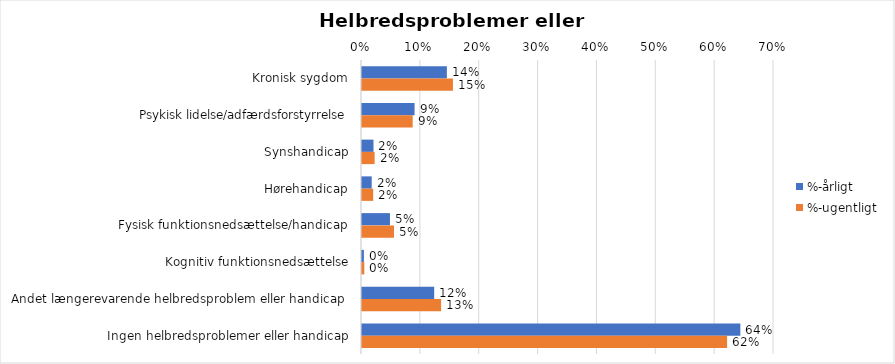
| Category | %-årligt | %-ugentligt |
|---|---|---|
| Kronisk sygdom | 0.144 | 0.155 |
| Psykisk lidelse/adfærdsforstyrrelse | 0.089 | 0.086 |
| Synshandicap | 0.02 | 0.021 |
| Hørehandicap | 0.016 | 0.019 |
| Fysisk funktionsnedsættelse/handicap | 0.048 | 0.054 |
| Kognitiv funktionsnedsættelse | 0.003 | 0.004 |
| Andet længerevarende helbredsproblem eller handicap  | 0.123 | 0.134 |
| Ingen helbredsproblemer eller handicap | 0.643 | 0.62 |